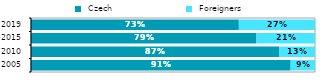
| Category |  Czech |  Foreigners |
|---|---|---|
| 2005.0 | 0.914 | 0.086 |
| 2010.0 | 0.873 | 0.127 |
| 2015.0 | 0.794 | 0.206 |
| 2019.0 | 0.732 | 0.268 |